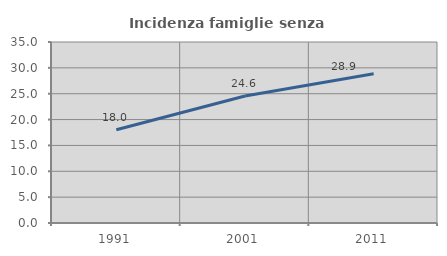
| Category | Incidenza famiglie senza nuclei |
|---|---|
| 1991.0 | 18.021 |
| 2001.0 | 24.559 |
| 2011.0 | 28.855 |